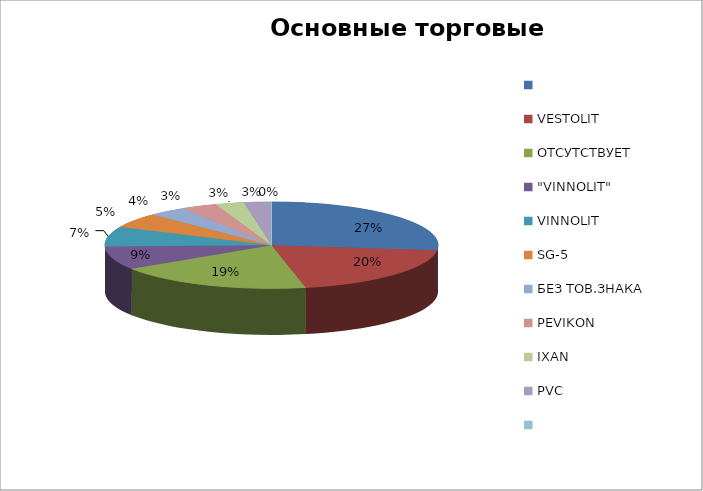
| Category | Стоимость, USD |
|---|---|
|  | 3778554.77 |
| VESTOLIT | 2801516.24 |
| ОТСУТСТВУЕТ | 2690566.69 |
| "VINNOLIT" | 1215515.77 |
| VINNOLIT | 1052597.68 |
| SG-5 | 768313.2 |
| БЕЗ ТОВ.ЗНАКА | 533254.19 |
| PEVIKON | 476538.39 |
| IXAN | 390901.25 |
| PVC | 374440 |